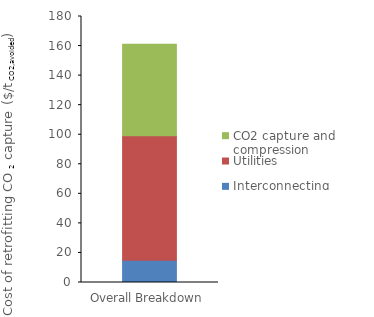
| Category | Interconnecting | Utilities | CO2 capture and compression |
|---|---|---|---|
| 0 | 15.082 | 84.217 | 61.861 |